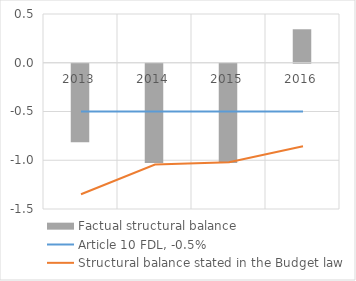
| Category | Factual structural balance |
|---|---|
| 2013.0 | -0.805 |
| 2014.0 | -1.019 |
| 2015.0 | -1.017 |
| 2016.0 | 0.343 |